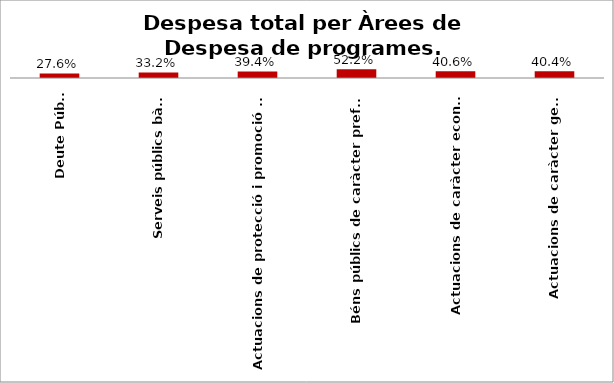
| Category | Series 0 |
|---|---|
| Deute Públic | 0.276 |
| Serveis públics bàsics | 0.332 |
| Actuacions de protecció i promoció social | 0.394 |
| Béns públics de caràcter preferent | 0.522 |
| Actuacions de caràcter econòmic | 0.406 |
| Actuacions de caràcter general | 0.404 |